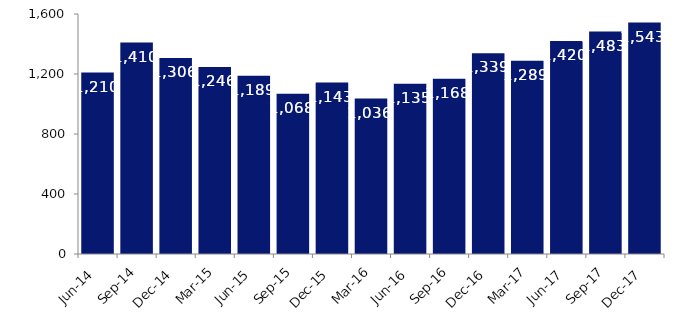
| Category | Series 0 |
|---|---|
| Jun-14 | 1210 |
| Sep-14 | 1410 |
| Dec-14 | 1306 |
| Mar-15 | 1246 |
| Jun-15 | 1189 |
| Sep-15 | 1068 |
| Dec-15 | 1143 |
| Mar-16 | 1036 |
| Jun-16 | 1135 |
| Sep-16 | 1168 |
| Dec-16 | 1339 |
| Mar-17 | 1289 |
| Jun-17 | 1420 |
| Sep-17 | 1483 |
| Dec-17 | 1543 |